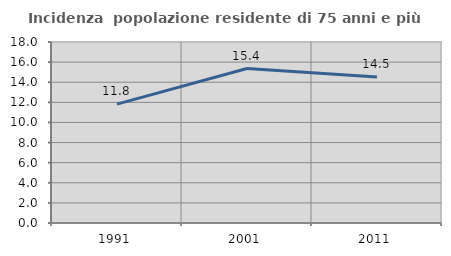
| Category | Incidenza  popolazione residente di 75 anni e più |
|---|---|
| 1991.0 | 11.827 |
| 2001.0 | 15.363 |
| 2011.0 | 14.516 |